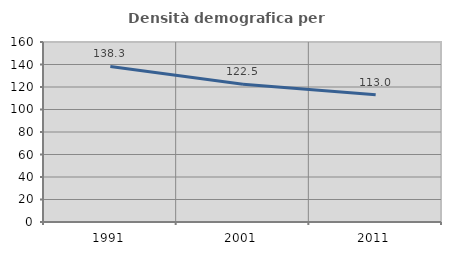
| Category | Densità demografica |
|---|---|
| 1991.0 | 138.302 |
| 2001.0 | 122.477 |
| 2011.0 | 113.05 |